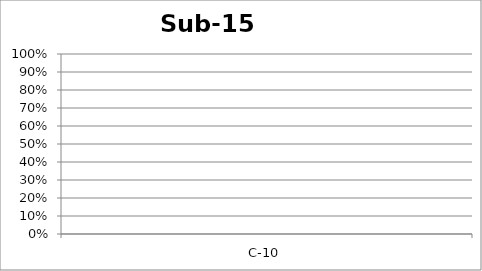
| Category | Sub-15 |
|---|---|
| C-10 | 0 |